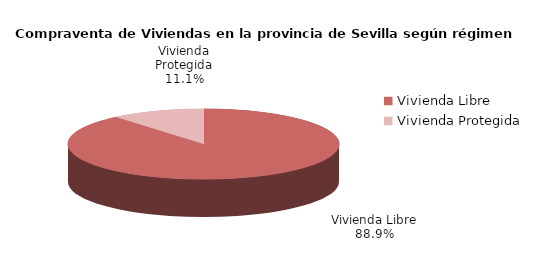
| Category | Series 0 | Series 1 |
|---|---|---|
| Vivienda Libre | 1612 | 0.889 |
| Vivienda Protegida | 201 | 0.111 |